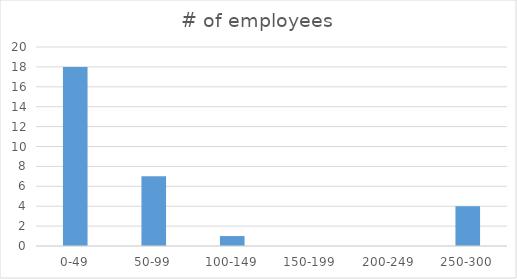
| Category | # of employees |
|---|---|
| 0-49 | 18 |
| 50-99 | 7 |
| 100-149 | 1 |
| 150-199 | 0 |
| 200-249 | 0 |
| 250-300 | 4 |